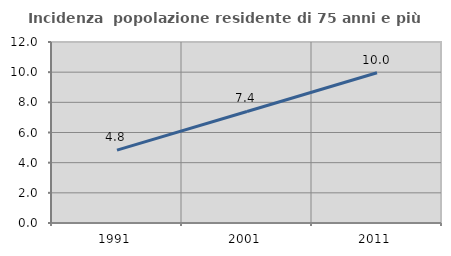
| Category | Incidenza  popolazione residente di 75 anni e più |
|---|---|
| 1991.0 | 4.83 |
| 2001.0 | 7.395 |
| 2011.0 | 9.965 |